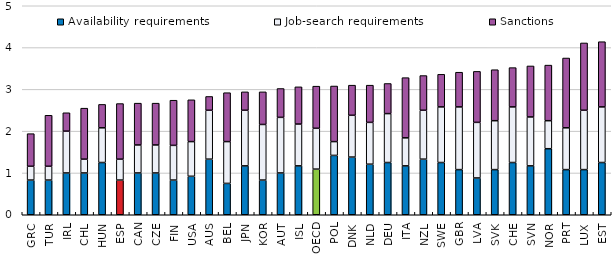
| Category | Availability requirements | Job-search requirements | Sanctions |
|---|---|---|---|
| GRC | 0.83 | 0.33 | 0.78 |
| TUR | 0.83 | 0.33 | 1.22 |
| IRL | 1 | 1 | 0.44 |
| CHL | 1 | 0.33 | 1.22 |
| HUN | 1.25 | 0.83 | 0.56 |
| ESP | 0.83 | 0.5 | 1.33 |
| CAN | 1 | 0.67 | 1 |
| CZE | 1 | 0.67 | 1 |
| FIN | 0.83 | 0.83 | 1.08 |
| USA | 0.92 | 0.83 | 1 |
| AUS | 1.33 | 1.17 | 0.33 |
| BEL | 0.75 | 1 | 1.17 |
| JPN | 1.17 | 1.33 | 0.44 |
| KOR | 0.83 | 1.33 | 0.78 |
| AUT | 1 | 1.33 | 0.69 |
| ISL | 1.17 | 1 | 0.89 |
| OECD | 1.092 | 0.977 | 1.007 |
| POL | 1.42 | 0.33 | 1.33 |
| DNK | 1.38 | 1 | 0.72 |
| NLD | 1.21 | 1 | 0.89 |
| DEU | 1.25 | 1.17 | 0.72 |
| ITA | 1.17 | 0.67 | 1.44 |
| NZL | 1.33 | 1.17 | 0.83 |
| SWE | 1.25 | 1.33 | 0.78 |
| GBR | 1.08 | 1.5 | 0.83 |
| LVA | 0.88 | 1.33 | 1.22 |
| SVK | 1.08 | 1.17 | 1.22 |
| CHE | 1.25 | 1.33 | 0.94 |
| SVN | 1.17 | 1.17 | 1.22 |
| NOR | 1.58 | 0.67 | 1.33 |
| PRT | 1.08 | 1 | 1.67 |
| LUX | 1.08 | 1.42 | 1.61 |
| EST | 1.25 | 1.33 | 1.56 |